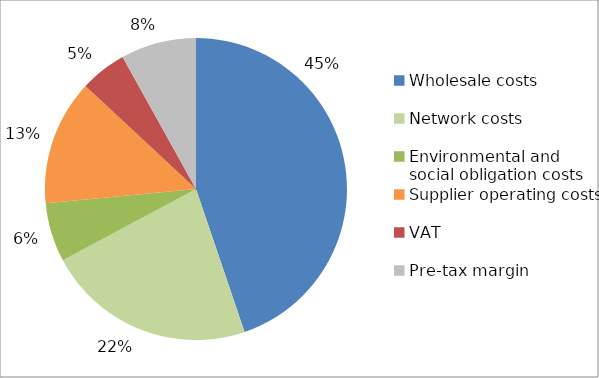
| Category | Series 0 |
|---|---|
| Wholesale costs | 0.449 |
| Network costs | 0.224 |
| Environmental and social obligation costs | 0.063 |
| Supplier operating costs | 0.135 |
| VAT | 0.05 |
| Pre-tax margin | 0.081 |